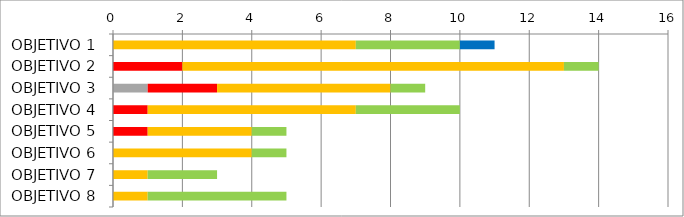
| Category | Series 0 | Series 1 | Series 2 | Series 3 | Series 4 | Series 5 |
|---|---|---|---|---|---|---|
| OBJETIVO 1 | 0 | 0 | 0 | 7 | 3 | 1 |
| OBJETIVO 2 | 0 | 0 | 2 | 11 | 1 | 0 |
| OBJETIVO 3 | 0 | 1 | 2 | 5 | 1 | 0 |
| OBJETIVO 4 | 0 | 0 | 1 | 6 | 3 | 0 |
| OBJETIVO 5 | 0 | 0 | 1 | 3 | 1 | 0 |
| OBJETIVO 6 | 0 | 0 | 0 | 4 | 1 | 0 |
| OBJETIVO 7 | 0 | 0 | 0 | 1 | 2 | 0 |
| OBJETIVO 8 | 0 | 0 | 0 | 1 | 4 | 0 |